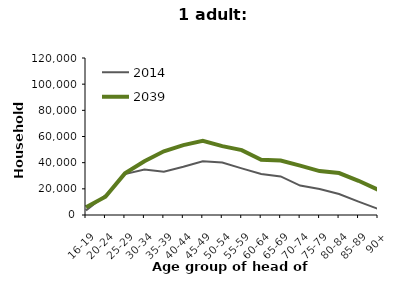
| Category | 2014 | 2039 |
|---|---|---|
| 16-19 | 3547 | 5920 |
| 20-24 | 15044 | 13918 |
| 25-29 | 31248 | 31825 |
| 30-34 | 34846 | 41082 |
| 35-39 | 33067 | 48724 |
| 40-44 | 36895 | 53393 |
| 45-49 | 41091 | 56630 |
| 50-54 | 40100 | 52617 |
| 55-59 | 35613 | 49566 |
| 60-64 | 31302 | 42208 |
| 65-69 | 29455 | 41577 |
| 70-74 | 22491 | 37741 |
| 75-79 | 19875 | 33583 |
| 80-84 | 15993 | 32071 |
| 85-89 | 10187 | 26138 |
| 90+ | 4695 | 19295 |